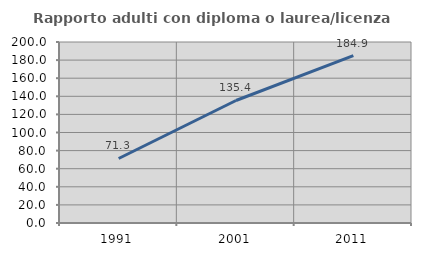
| Category | Rapporto adulti con diploma o laurea/licenza media  |
|---|---|
| 1991.0 | 71.286 |
| 2001.0 | 135.368 |
| 2011.0 | 184.89 |